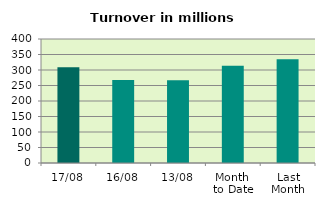
| Category | Series 0 |
|---|---|
| 17/08 | 309.166 |
| 16/08 | 268.02 |
| 13/08 | 267.006 |
| Month 
to Date | 313.38 |
| Last
Month | 334.97 |